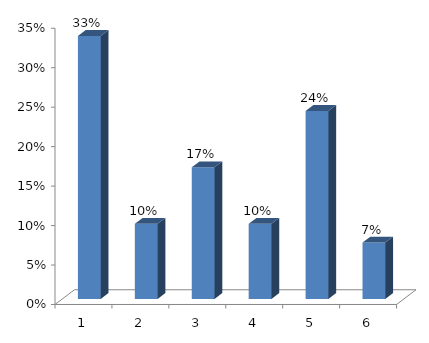
| Category | Series 0 |
|---|---|
| 0 | 0.333 |
| 1 | 0.095 |
| 2 | 0.167 |
| 3 | 0.095 |
| 4 | 0.238 |
| 5 | 0.071 |